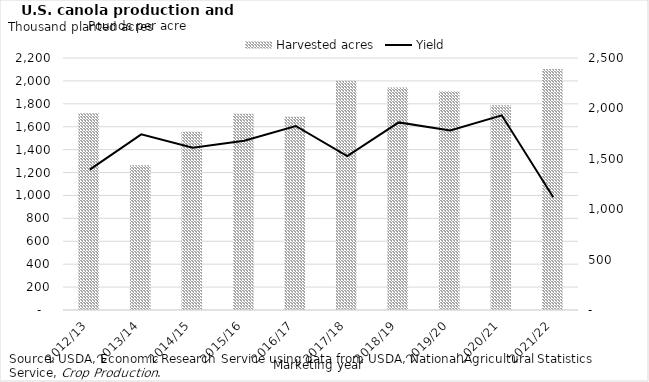
| Category | Harvested acres |
|---|---|
| 2012/13 | 1717.9 |
| 2013/14 | 1264.5 |
| 2014/15 | 1556.7 |
| 2015/16 | 1713.5 |
| 2016/17 | 1686.7 |
| 2017/18 | 2002 |
| 2018/19 | 1942.5 |
| 2019/20 | 1909.5 |
| 2020/21 | 1787.8 |
| 2021/22 | 2104.5 |